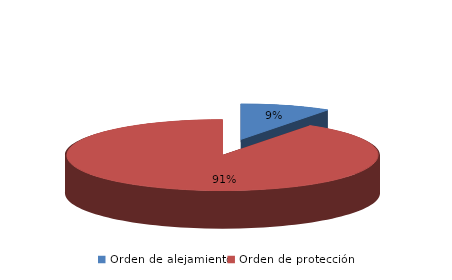
| Category | Series 0 |
|---|---|
| Orden de alejamiento | 30 |
| Orden de protección | 292 |